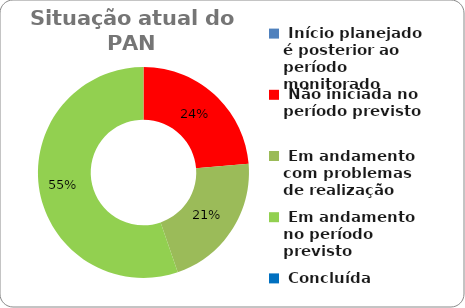
| Category | Series 0 |
|---|---|
|  Início planejado é posterior ao período monitorado | 0 |
|  Não iniciada no período previsto | 0.237 |
|  Em andamento com problemas de realização | 0.211 |
|  Em andamento no período previsto  | 0.553 |
|  Concluída | 0 |